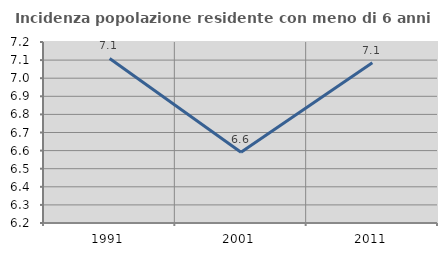
| Category | Incidenza popolazione residente con meno di 6 anni |
|---|---|
| 1991.0 | 7.109 |
| 2001.0 | 6.591 |
| 2011.0 | 7.085 |